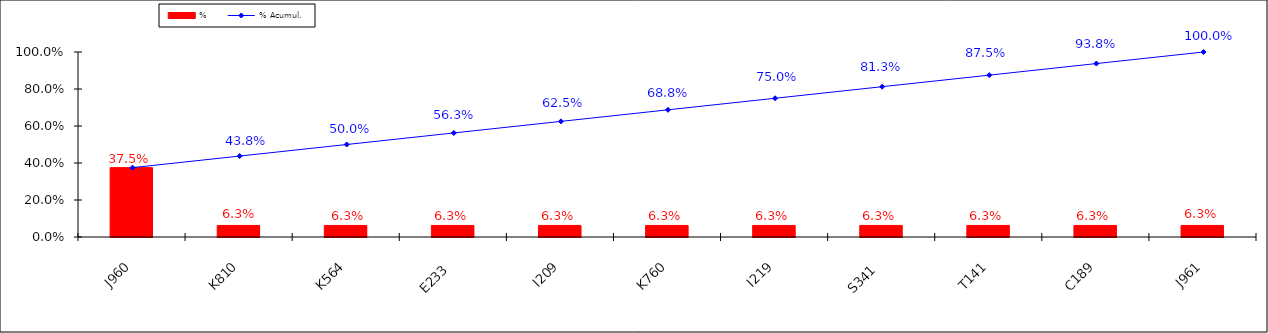
| Category | % |
|---|---|
| J960 | 0.375 |
| K810 | 0.062 |
| K564 | 0.062 |
| E233 | 0.062 |
| I209 | 0.062 |
| K760 | 0.062 |
| I219 | 0.062 |
| S341 | 0.062 |
| T141 | 0.062 |
| C189 | 0.062 |
| J961 | 0.062 |